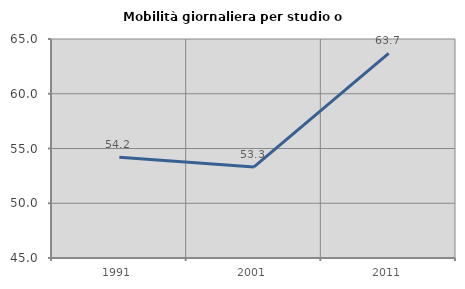
| Category | Mobilità giornaliera per studio o lavoro |
|---|---|
| 1991.0 | 54.201 |
| 2001.0 | 53.314 |
| 2011.0 | 63.682 |